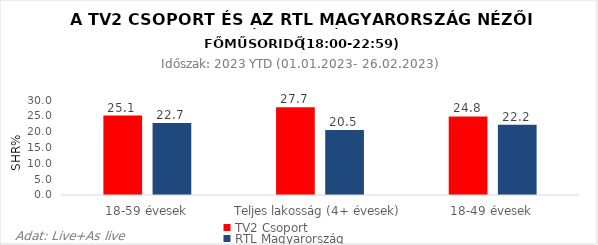
| Category | TV2 Csoport | RTL Magyarország |
|---|---|---|
| 18-59 évesek | 25.1 | 22.7 |
| Teljes lakosság (4+ évesek) | 27.7 | 20.5 |
| 18-49 évesek | 24.8 | 22.2 |